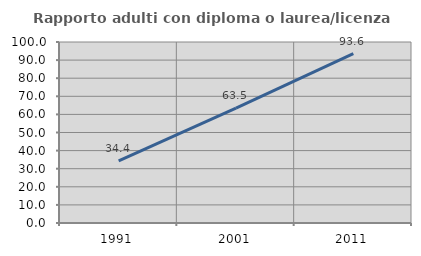
| Category | Rapporto adulti con diploma o laurea/licenza media  |
|---|---|
| 1991.0 | 34.369 |
| 2001.0 | 63.475 |
| 2011.0 | 93.599 |